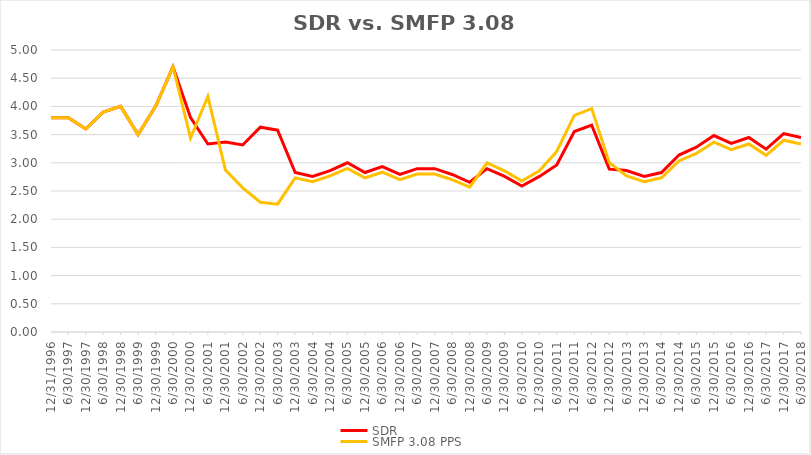
| Category | SDR | SMFP 3.08 PPS |
|---|---|---|
| 12/31/96 | 3.8 | 3.8 |
| 6/30/97 | 3.8 | 3.8 |
| 12/31/97 | 3.6 | 3.6 |
| 6/30/98 | 3.9 | 3.9 |
| 12/31/98 | 4 | 4 |
| 6/30/99 | 3.5 | 3.5 |
| 12/31/99 | 4 | 4 |
| 6/30/00 | 4.7 | 4.7 |
| 12/31/00 | 3.8 | 3.44 |
| 6/30/01 | 3.333 | 4.176 |
| 12/31/01 | 3.368 | 2.87 |
| 6/30/02 | 3.316 | 2.556 |
| 12/31/02 | 3.632 | 2.3 |
| 6/30/03 | 3.579 | 2.267 |
| 12/31/03 | 2.828 | 2.733 |
| 6/30/04 | 2.759 | 2.667 |
| 12/31/04 | 2.862 | 2.767 |
| 6/30/05 | 3 | 2.9 |
| 12/31/05 | 2.828 | 2.733 |
| 6/30/06 | 2.931 | 2.833 |
| 12/31/06 | 2.793 | 2.7 |
| 6/30/07 | 2.897 | 2.8 |
| 12/31/07 | 2.897 | 2.8 |
| 6/30/08 | 2.793 | 2.7 |
| 12/31/08 | 2.655 | 2.567 |
| 6/30/09 | 2.897 | 3 |
| 12/31/09 | 2.759 | 2.857 |
| 6/30/10 | 2.586 | 2.679 |
| 12/31/10 | 2.759 | 2.857 |
| 6/30/11 | 2.963 | 3.2 |
| 12/31/11 | 3.556 | 3.84 |
| 6/30/12 | 3.667 | 3.96 |
| 12/31/12 | 2.889 | 3.003 |
| 6/30/13 | 2.862 | 2.767 |
| 12/31/13 | 2.759 | 2.667 |
| 6/30/14 | 2.828 | 2.733 |
| 12/31/14 | 3.138 | 3.033 |
| 6/30/15 | 3.276 | 3.167 |
| 12/31/15 | 3.483 | 3.367 |
| 6/30/16 | 3.345 | 3.233 |
| 12/31/16 | 3.448 | 3.333 |
| 6/30/17 | 3.241 | 3.133 |
| 12/31/17 | 3.517 | 3.4 |
| 6/30/18 | 3.448 | 3.333 |